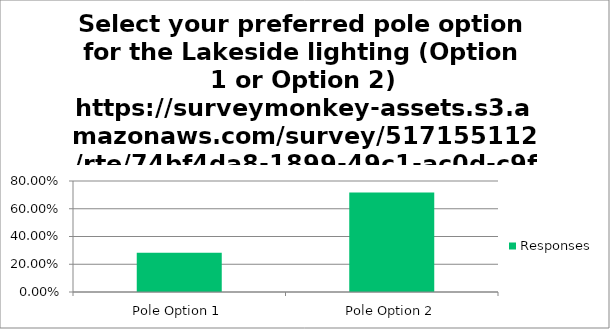
| Category | Responses |
|---|---|
| Pole Option 1 | 0.283 |
| Pole Option 2 | 0.717 |